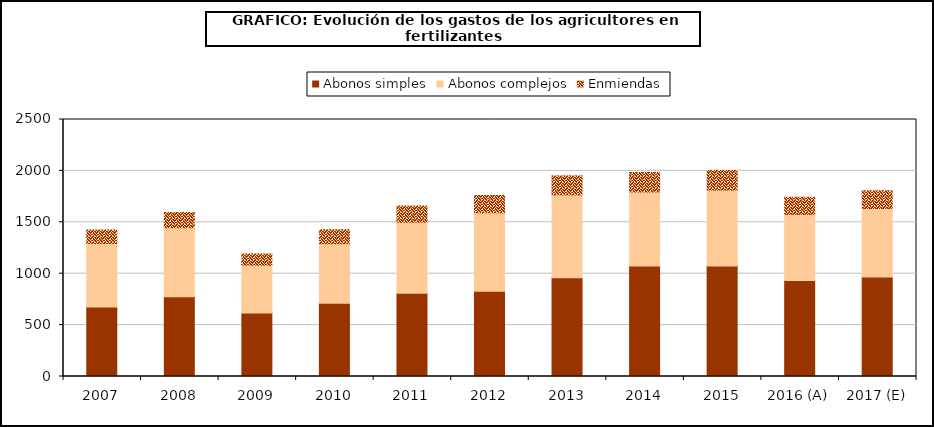
| Category | Abonos simples | Abonos complejos | Enmiendas |
|---|---|---|---|
| 2007 | 675.341 | 618.526 | 131.725 |
| 2008 | 776.533 | 671.033 | 147.519 |
| 2009 | 617.926 | 464.475 | 110.568 |
| 2010 | 711.864 | 580.242 | 135.989 |
| 2011 | 809.32 | 692.087 | 157.487 |
| 2012 | 828.171 | 764.88 | 167.637 |
| 2013 | 959.679 | 806.665 | 185.766 |
| 2014 | 1074.953 | 720.53 | 188.831 |
| 2015 | 1074.955 | 739.068 | 190.781 |
| 2016 (A) | 934.771 | 642.687 | 165.901 |
| 2017 (E) | 968.477 | 665.861 | 171.883 |